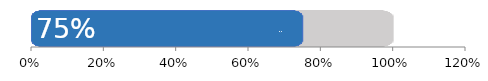
| Category | Всего | Женщины |
|---|---|---|
| 0 | 1 | 0.75 |